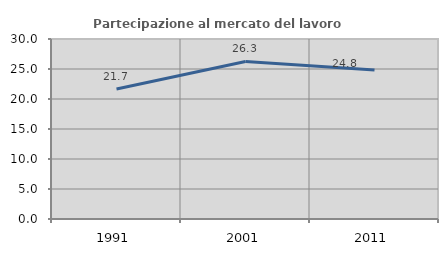
| Category | Partecipazione al mercato del lavoro  femminile |
|---|---|
| 1991.0 | 21.666 |
| 2001.0 | 26.262 |
| 2011.0 | 24.833 |